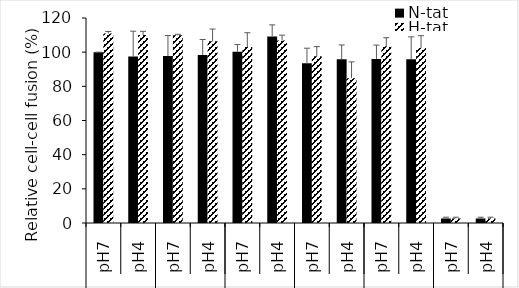
| Category | N-tat | H-tat |
|---|---|---|
| 0 | 100 | 110.912 |
| 1 | 97.488 | 110.029 |
| 2 | 97.74 | 109.907 |
| 3 | 98.402 | 106.368 |
| 4 | 100.286 | 103.015 |
| 5 | 109.154 | 106.827 |
| 6 | 93.483 | 97.553 |
| 7 | 95.86 | 84.774 |
| 8 | 95.964 | 103.443 |
| 9 | 95.808 | 102.404 |
| 10 | 2.653 | 2.653 |
| 11 | 2.653 | 2.653 |